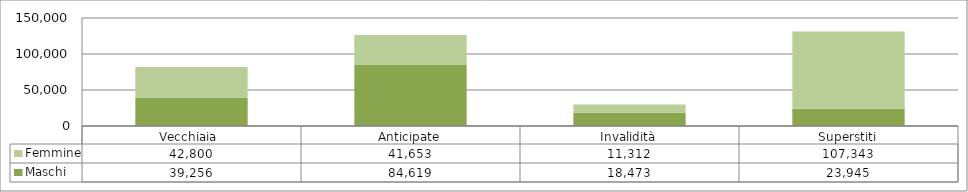
| Category | Maschi | Femmine |
|---|---|---|
| Vecchiaia  | 39256 | 42800 |
| Anticipate | 84619 | 41653 |
| Invalidità | 18473 | 11312 |
| Superstiti | 23945 | 107343 |